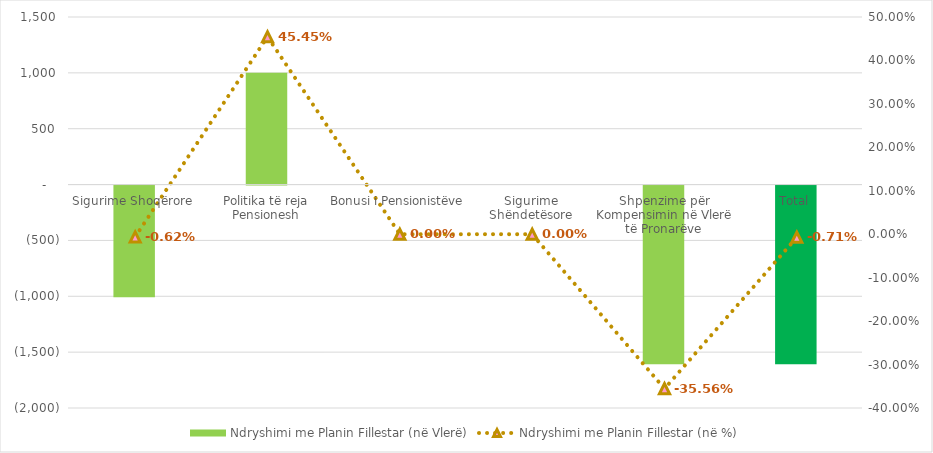
| Category | Ndryshimi me Planin Fillestar (në Vlerë) |
|---|---|
| Sigurime Shoqërore | -1000 |
| Politika të reja Pensionesh | 1000 |
| Bonusi i Pensionistëve | 0 |
| Sigurime Shëndetësore | 0 |
| Shpenzime për Kompensimin në Vlerë të Pronarëve | -1600 |
| Total | -1600 |